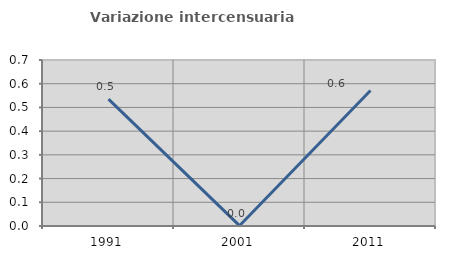
| Category | Variazione intercensuaria annua |
|---|---|
| 1991.0 | 0.535 |
| 2001.0 | 0.001 |
| 2011.0 | 0.572 |